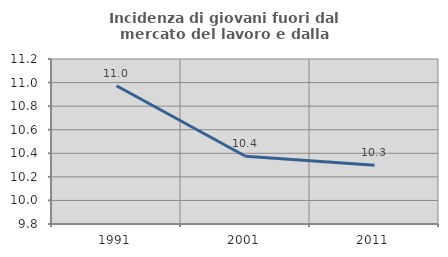
| Category | Incidenza di giovani fuori dal mercato del lavoro e dalla formazione  |
|---|---|
| 1991.0 | 10.973 |
| 2001.0 | 10.375 |
| 2011.0 | 10.299 |